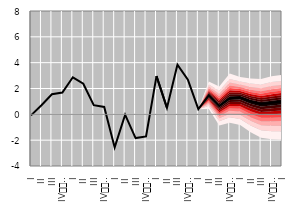
| Category | Series 0 |
|---|---|
| I | -0.082 |
| II | 0.706 |
| III | 1.553 |
| IV
2010. | 1.69 |
| I | 2.867 |
| II | 2.369 |
| III | 0.707 |
| IV
2011. | 0.572 |
| I | -2.561 |
| II | -0.027 |
| III | -1.836 |
| IV
2012. | -1.706 |
| I | 2.957 |
| II | 0.497 |
| III | 3.844 |
| IV
2013. | 2.676 |
| I | 0.4 |
| II | 1.473 |
| III | 0.649 |
| IV
2014. | 1.253 |
| I | 1.306 |
| II | 1.004 |
| III | 0.802 |
| IV
2015. | 0.903 |
| I | 1 |